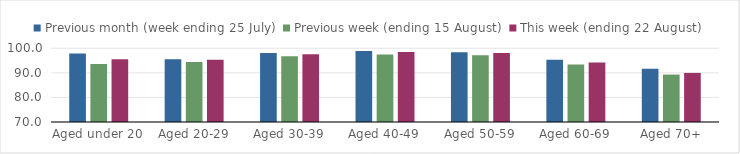
| Category | Previous month (week ending 25 July) | Previous week (ending 15 August) | This week (ending 22 August) |
|---|---|---|---|
| Aged under 20 | 97.891 | 93.588 | 95.518 |
| Aged 20-29 | 95.572 | 94.416 | 95.313 |
| Aged 30-39 | 98.074 | 96.735 | 97.57 |
| Aged 40-49 | 98.875 | 97.512 | 98.452 |
| Aged 50-59 | 98.433 | 97.21 | 98.115 |
| Aged 60-69 | 95.355 | 93.425 | 94.208 |
| Aged 70+ | 91.701 | 89.303 | 89.972 |